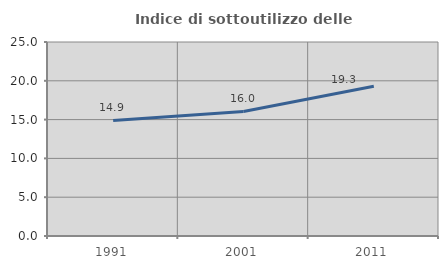
| Category | Indice di sottoutilizzo delle abitazioni  |
|---|---|
| 1991.0 | 14.894 |
| 2001.0 | 16.045 |
| 2011.0 | 19.3 |